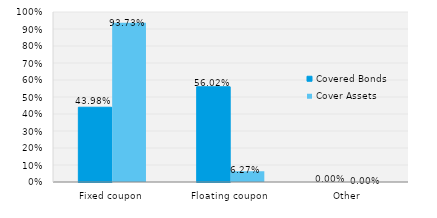
| Category | Covered Bonds | Cover Assets |
|---|---|---|
| Fixed coupon | 0.44 | 0.937 |
| Floating coupon | 0.56 | 0.063 |
| Other | 0 | 0 |